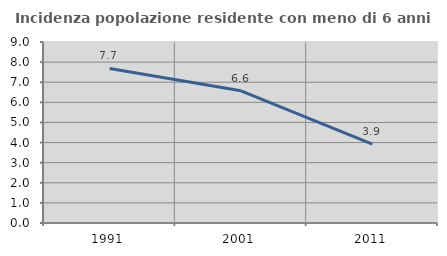
| Category | Incidenza popolazione residente con meno di 6 anni |
|---|---|
| 1991.0 | 7.687 |
| 2001.0 | 6.572 |
| 2011.0 | 3.92 |